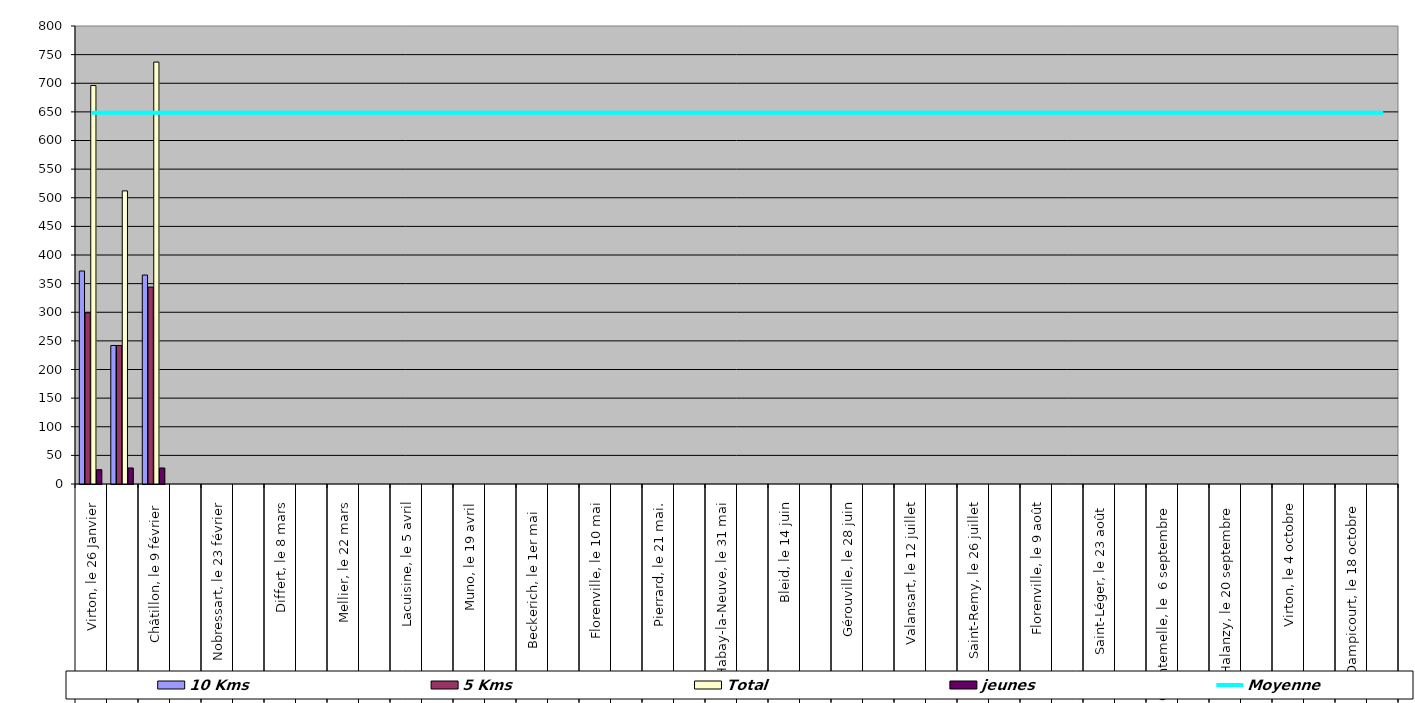
| Category | 10 Kms | 5 Kms | Total | jeunes |
|---|---|---|---|---|
| 0 | 372 | 299 | 696 | 25 |
| 1 | 242 | 242 | 512 | 28 |
| 2 | 365 | 344 | 737 | 28 |
| 3 | 0 | 0 | 0 | 0 |
| 4 | 0 | 0 | 0 | 0 |
| 5 | 0 | 0 | 0 | 0 |
| 6 | 0 | 0 | 0 | 0 |
| 7 | 0 | 0 | 0 | 0 |
| 8 | 0 | 0 | 0 | 0 |
| 9 | 0 | 0 | 0 | 0 |
| 10 | 0 | 0 | 0 | 0 |
| 11 | 0 | 0 | 0 | 0 |
| 12 | 0 | 0 | 0 | 0 |
| 13 | 0 | 0 | 0 | 0 |
| 14 | 0 | 0 | 0 | 0 |
| 15 | 0 | 0 | 0 | 0 |
| 16 | 0 | 0 | 0 | 0 |
| 17 | 0 | 0 | 0 | 0 |
| 18 | 0 | 0 | 0 | 0 |
| 19 | 0 | 0 | 0 | 0 |
| 20 | 0 | 0 | 0 | 0 |
| 21 | 0 | 0 | 0 | 0 |
| 22 | 0 | 0 | 0 | 0 |
| 23 | 0 | 0 | 0 | 0 |
| 24 | 0 | 0 | 0 | 0 |
| 25 | 0 | 0 | 0 | 0 |
| 26 | 0 | 0 | 0 | 0 |
| 27 | 0 | 0 | 0 | 0 |
| 28 | 0 | 0 | 0 | 0 |
| 29 | 0 | 0 | 0 | 0 |
| 30 | 0 | 0 | 0 | 0 |
| 31 | 0 | 0 | 0 | 0 |
| 32 | 0 | 0 | 0 | 0 |
| 33 | 0 | 0 | 0 | 0 |
| 34 | 0 | 0 | 0 | 0 |
| 35 | 0 | 0 | 0 | 0 |
| 36 | 0 | 0 | 0 | 0 |
| 37 | 0 | 0 | 0 | 0 |
| 38 | 0 | 0 | 0 | 0 |
| 39 | 0 | 0 | 0 | 0 |
| 40 | 0 | 0 | 0 | 0 |
| 41 | 0 | 0 | 0 | 0 |